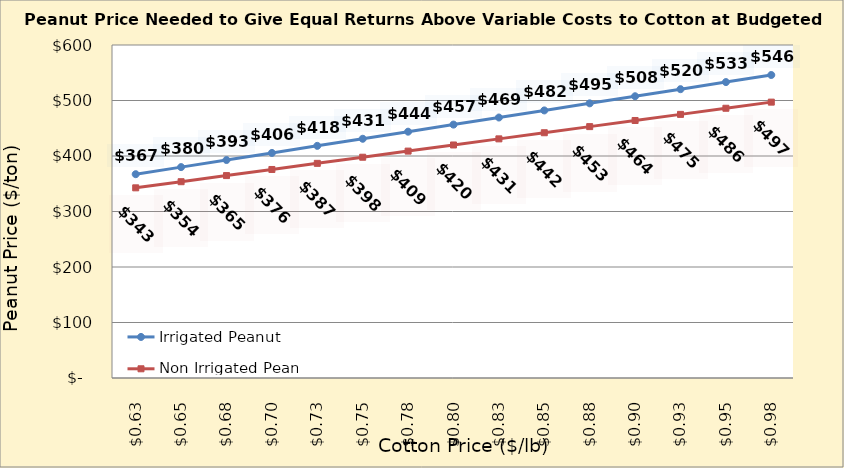
| Category | Irrigated Peanut | Non Irrigated Peanut |
|---|---|---|
| 0.6249999999999999 | 367.221 | 342.644 |
| 0.6499999999999999 | 379.987 | 353.673 |
| 0.6749999999999999 | 392.753 | 364.702 |
| 0.7 | 405.519 | 375.732 |
| 0.725 | 418.285 | 386.761 |
| 0.75 | 431.051 | 397.791 |
| 0.775 | 443.817 | 408.82 |
| 0.8 | 456.583 | 419.85 |
| 0.8250000000000001 | 469.349 | 430.879 |
| 0.8500000000000001 | 482.115 | 441.908 |
| 0.8750000000000001 | 494.881 | 452.938 |
| 0.9000000000000001 | 507.647 | 463.967 |
| 0.9250000000000002 | 520.412 | 474.997 |
| 0.9500000000000002 | 533.178 | 486.026 |
| 0.9750000000000002 | 545.944 | 497.055 |